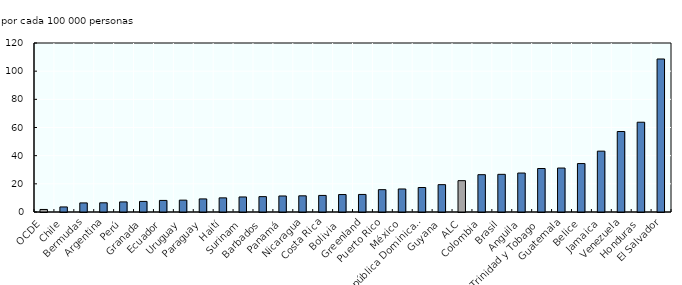
| Category | Series 0 |
|---|---|
| OCDE | 1.8 |
| Chile | 3.59 |
| Bermudas | 6.45 |
| Argentina | 6.53 |
| Perú | 7.16 |
| Granada | 7.52 |
| Ecuador | 8.23 |
| Uruguay | 8.42 |
| Paraguay | 9.29 |
| Haití | 10.04 |
| Surinam | 10.68 |
| Barbados | 10.91 |
| Panamá | 11.38 |
| Nicaragua | 11.49 |
| Costa Rica | 11.77 |
| Bolivia  | 12.4 |
| Greenland | 12.46 |
| Puerto Rico | 15.86 |
| México | 16.35 |
| República Dominicana | 17.39 |
| Guyana | 19.42 |
| ALC | 22.249 |
| Colombia | 26.5 |
| Brasil | 26.74 |
| Anguila | 27.66 |
| Trinidad y Tobago | 30.88 |
| Guatemala | 31.21 |
| Belice | 34.4 |
| Jamaica | 43.21 |
| Venezuela | 57.15 |
| Honduras | 63.75 |
| El Salvador | 108.64 |